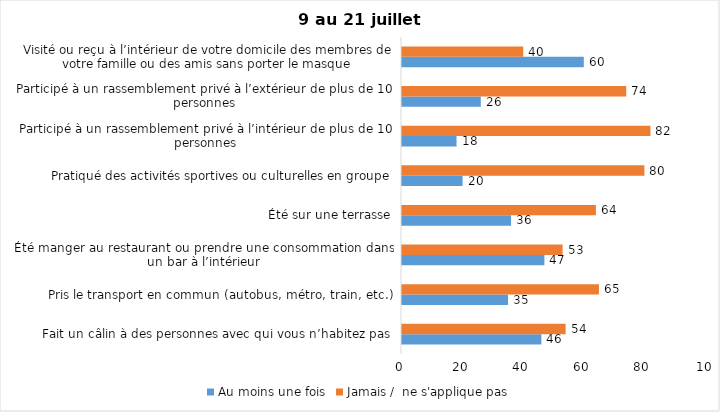
| Category | Au moins une fois | Jamais /  ne s'applique pas |
|---|---|---|
| Fait un câlin à des personnes avec qui vous n’habitez pas | 46 | 54 |
| Pris le transport en commun (autobus, métro, train, etc.) | 35 | 65 |
| Été manger au restaurant ou prendre une consommation dans un bar à l’intérieur | 47 | 53 |
| Été sur une terrasse | 36 | 64 |
| Pratiqué des activités sportives ou culturelles en groupe | 20 | 80 |
| Participé à un rassemblement privé à l’intérieur de plus de 10 personnes | 18 | 82 |
| Participé à un rassemblement privé à l’extérieur de plus de 10 personnes | 26 | 74 |
| Visité ou reçu à l’intérieur de votre domicile des membres de votre famille ou des amis sans porter le masque | 60 | 40 |